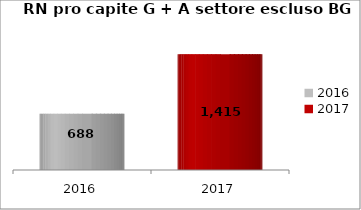
| Category | RN pro capite G + A settore escluso BG |
|---|---|
| 2016.0 | 687.549 |
| 2017.0 | 1415.156 |